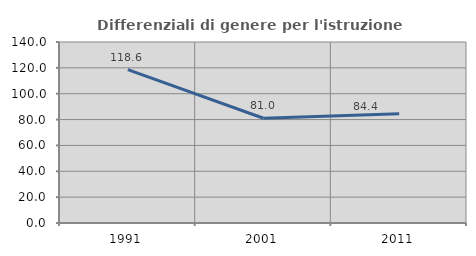
| Category | Differenziali di genere per l'istruzione superiore |
|---|---|
| 1991.0 | 118.58 |
| 2001.0 | 81.028 |
| 2011.0 | 84.422 |